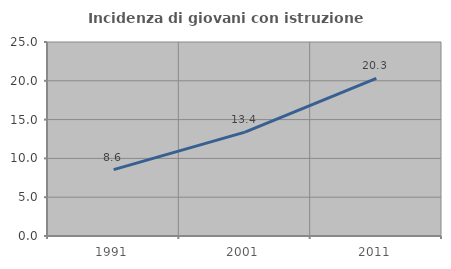
| Category | Incidenza di giovani con istruzione universitaria |
|---|---|
| 1991.0 | 8.56 |
| 2001.0 | 13.382 |
| 2011.0 | 20.3 |